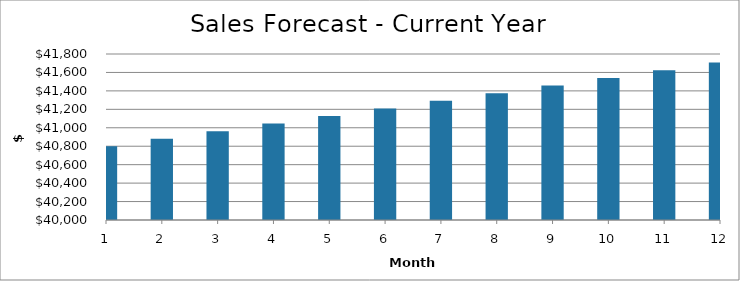
| Category | Year 1 |
|---|---|
| 1.0 | 40800 |
| 2.0 | 40881.641 |
| 3.0 | 40963.445 |
| 4.0 | 41045.413 |
| 5.0 | 41127.545 |
| 6.0 | 41209.841 |
| 7.0 | 41292.302 |
| 8.0 | 41374.928 |
| 9.0 | 41457.719 |
| 10.0 | 41540.676 |
| 11.0 | 41623.799 |
| 12.0 | 41707.088 |